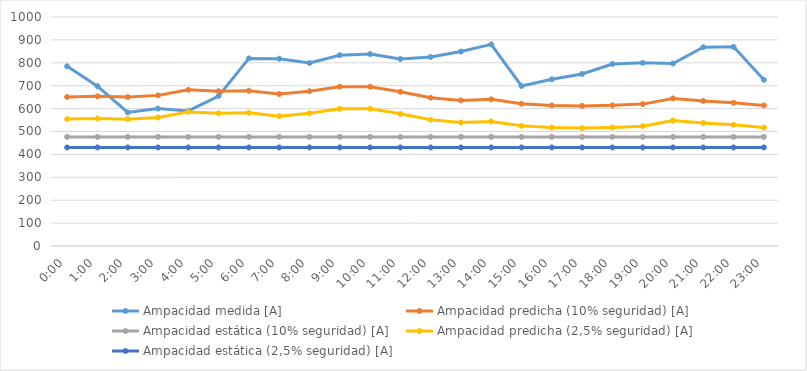
| Category | Ampacidad medida [A] | Ampacidad predicha (10% seguridad) [A] | Ampacidad estática (10% seguridad) [A] | Ampacidad predicha (2,5% seguridad) [A] | Ampacidad estática (2,5% seguridad) [A] |
|---|---|---|---|---|---|
| 0.0 | 784.716 | 650.827 | 476.5 | 554.393 | 430.4 |
| 0.041666666666666664 | 697.95 | 653.465 | 476.5 | 557.031 | 430.4 |
| 0.08333333333333333 | 583.184 | 650.453 | 476.5 | 554.02 | 430.4 |
| 0.125 | 600.212 | 657.758 | 476.5 | 561.324 | 430.4 |
| 0.166666666666667 | 589.923 | 682.05 | 476.5 | 585.617 | 430.4 |
| 0.208333333333333 | 655.09 | 676.076 | 476.5 | 579.643 | 430.4 |
| 0.25 | 819.273 | 678.107 | 476.5 | 581.673 | 430.4 |
| 0.291666666666667 | 817.698 | 663.485 | 476.5 | 567.051 | 430.4 |
| 0.333333333333333 | 799.314 | 675.801 | 476.5 | 579.367 | 430.4 |
| 0.375 | 833.278 | 695.508 | 476.5 | 599.074 | 430.4 |
| 0.416666666666667 | 838.072 | 695.704 | 476.5 | 599.271 | 430.4 |
| 0.458333333333333 | 816.836 | 673.603 | 476.5 | 577.169 | 430.4 |
| 0.5 | 825.351 | 647.592 | 476.5 | 551.158 | 430.4 |
| 0.541666666666667 | 849.136 | 635.631 | 476.5 | 539.197 | 430.4 |
| 0.583333333333333 | 880.52 | 640.299 | 476.5 | 543.865 | 430.4 |
| 0.625 | 698.777 | 621.145 | 476.5 | 524.711 | 430.4 |
| 0.666666666666667 | 727.801 | 614.018 | 476.5 | 517.584 | 430.4 |
| 0.708333333333333 | 751.281 | 611.609 | 476.5 | 515.176 | 430.4 |
| 0.75 | 794.873 | 614.328 | 476.5 | 517.894 | 430.4 |
| 0.791666666666667 | 799.959 | 619.606 | 476.5 | 523.173 | 430.4 |
| 0.833333333333333 | 796.953 | 644.399 | 476.5 | 547.965 | 430.4 |
| 0.875 | 868.01 | 633.391 | 476.5 | 536.958 | 430.4 |
| 0.916666666666667 | 869.617 | 625.55 | 476.5 | 529.116 | 430.4 |
| 0.958333333333333 | 725.856 | 613.956 | 476.5 | 517.523 | 430.4 |